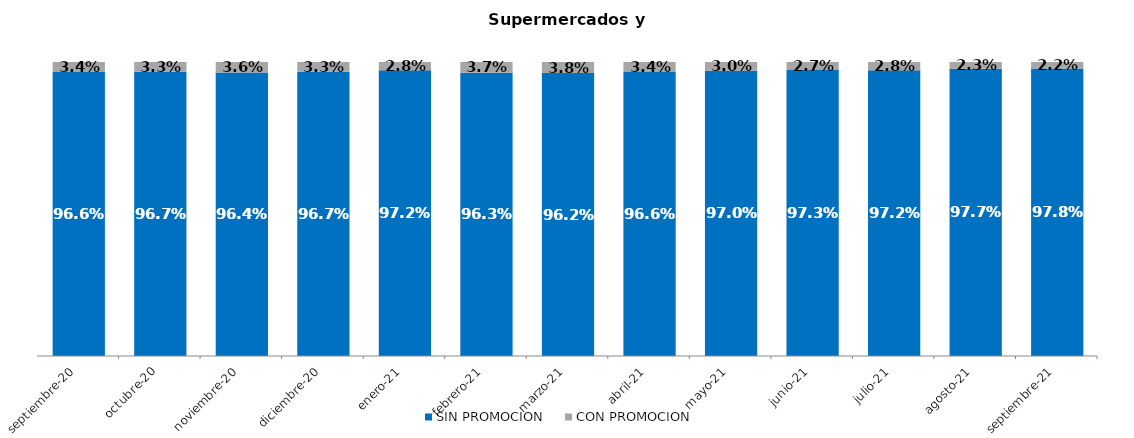
| Category | SIN PROMOCION   | CON PROMOCION   |
|---|---|---|
| 2020-09-01 | 0.966 | 0.034 |
| 2020-10-01 | 0.967 | 0.033 |
| 2020-11-01 | 0.964 | 0.036 |
| 2020-12-01 | 0.967 | 0.033 |
| 2021-01-01 | 0.972 | 0.028 |
| 2021-02-01 | 0.963 | 0.037 |
| 2021-03-01 | 0.962 | 0.038 |
| 2021-04-01 | 0.966 | 0.034 |
| 2021-05-01 | 0.97 | 0.03 |
| 2021-06-01 | 0.973 | 0.027 |
| 2021-07-01 | 0.972 | 0.028 |
| 2021-08-01 | 0.977 | 0.023 |
| 2021-09-01 | 0.978 | 0.022 |